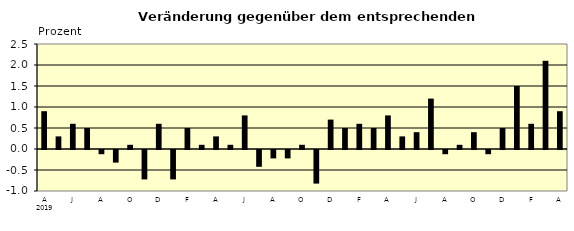
| Category | Series 0 |
|---|---|
| 0 | 0.9 |
| 1 | 0.3 |
| 2 | 0.6 |
| 3 | 0.5 |
| 4 | -0.1 |
| 5 | -0.3 |
| 6 | 0.1 |
| 7 | -0.7 |
| 8 | 0.6 |
| 9 | -0.7 |
| 10 | 0.5 |
| 11 | 0.1 |
| 12 | 0.3 |
| 13 | 0.1 |
| 14 | 0.8 |
| 15 | -0.4 |
| 16 | -0.2 |
| 17 | -0.2 |
| 18 | 0.1 |
| 19 | -0.8 |
| 20 | 0.7 |
| 21 | 0.5 |
| 22 | 0.6 |
| 23 | 0.5 |
| 24 | 0.8 |
| 25 | 0.3 |
| 26 | 0.4 |
| 27 | 1.2 |
| 28 | -0.1 |
| 29 | 0.1 |
| 30 | 0.4 |
| 31 | -0.1 |
| 32 | 0.5 |
| 33 | 1.5 |
| 34 | 0.6 |
| 35 | 2.1 |
| 36 | 0.9 |